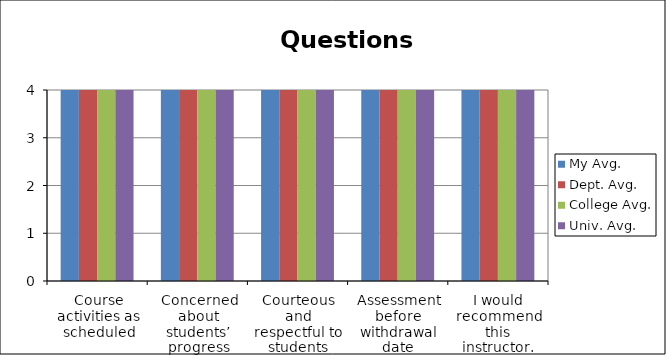
| Category | My Avg. | Dept. Avg. | College Avg. | Univ. Avg. |
|---|---|---|---|---|
| Course activities as scheduled | 4 | 4 | 4 | 4 |
| Concerned about students’ progress | 4 | 4 | 4 | 4 |
| Courteous and respectful to students | 4 | 4 | 4 | 4 |
| Assessment before withdrawal date | 4 | 4 | 4 | 4 |
| I would recommend this instructor. | 4 | 4 | 4 | 4 |